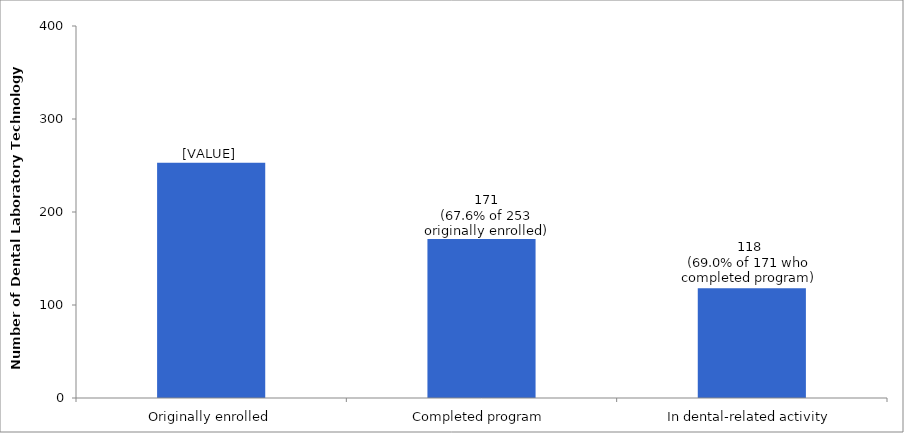
| Category | Series 0 |
|---|---|
| Originally enrolled | 253 |
| Completed program | 171 |
| In dental-related activity | 118 |